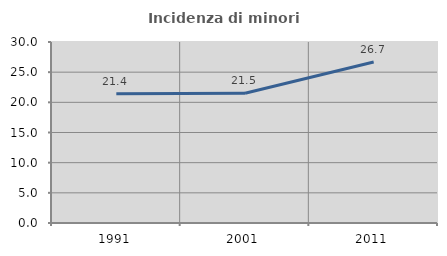
| Category | Incidenza di minori stranieri |
|---|---|
| 1991.0 | 21.429 |
| 2001.0 | 21.515 |
| 2011.0 | 26.681 |